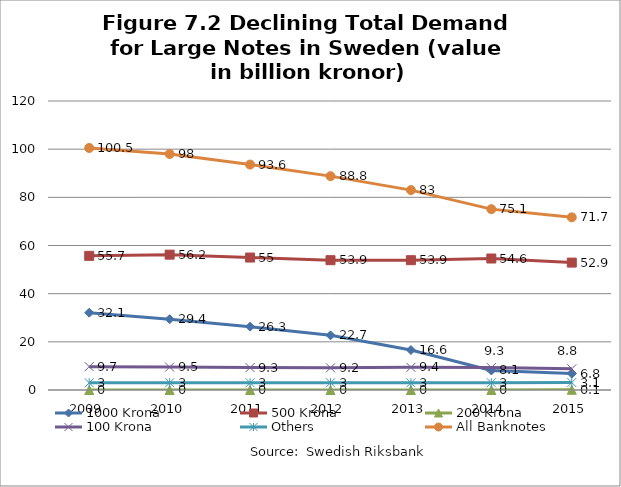
| Category | 1000 Krona | 500 Krona | 200 Krona | 100 Krona | Others | All Banknotes |
|---|---|---|---|---|---|---|
| 2009 | 32.1 | 55.7 | 0 | 9.7 | 3 | 100.5 |
| 2010 | 29.4 | 56.2 | 0 | 9.5 | 3 | 98 |
| 2011 | 26.3 | 55 | 0 | 9.3 | 3 | 93.6 |
| 2012 | 22.7 | 53.9 | 0 | 9.2 | 3 | 88.8 |
| 2013 | 16.6 | 53.9 | 0 | 9.4 | 3 | 83 |
| 2014 | 8.1 | 54.6 | 0 | 9.3 | 3 | 75.1 |
| 2015 | 6.8 | 52.9 | 0.1 | 8.8 | 3.1 | 71.7 |